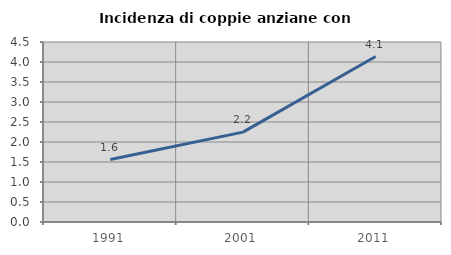
| Category | Incidenza di coppie anziane con figli |
|---|---|
| 1991.0 | 1.562 |
| 2001.0 | 2.247 |
| 2011.0 | 4.136 |